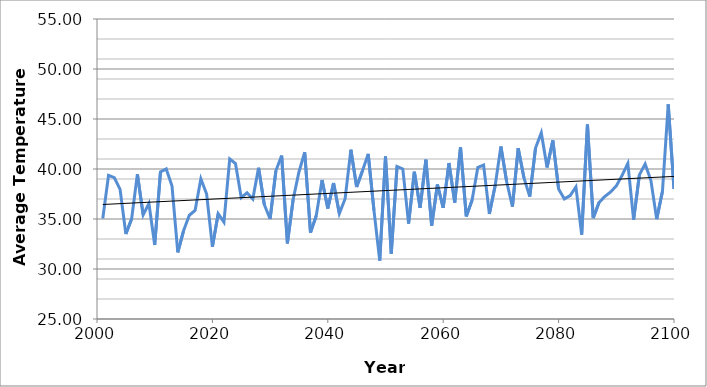
| Category | B1 |
|---|---|
| 2001.0 | 35.049 |
| 2002.0 | 39.366 |
| 2003.0 | 39.132 |
| 2004.0 | 37.967 |
| 2005.0 | 33.507 |
| 2006.0 | 35.006 |
| 2007.0 | 39.49 |
| 2008.0 | 35.413 |
| 2009.0 | 36.547 |
| 2010.0 | 32.401 |
| 2011.0 | 39.699 |
| 2012.0 | 40.008 |
| 2013.0 | 38.286 |
| 2014.0 | 31.662 |
| 2015.0 | 33.818 |
| 2016.0 | 35.375 |
| 2017.0 | 35.857 |
| 2018.0 | 39.024 |
| 2019.0 | 37.492 |
| 2020.0 | 32.218 |
| 2021.0 | 35.53 |
| 2022.0 | 34.678 |
| 2023.0 | 41.005 |
| 2024.0 | 40.539 |
| 2025.0 | 37.125 |
| 2026.0 | 37.616 |
| 2027.0 | 36.991 |
| 2028.0 | 40.134 |
| 2029.0 | 36.43 |
| 2030.0 | 34.995 |
| 2031.0 | 39.816 |
| 2032.0 | 41.34 |
| 2033.0 | 32.563 |
| 2034.0 | 36.97 |
| 2035.0 | 39.702 |
| 2036.0 | 41.675 |
| 2037.0 | 33.638 |
| 2038.0 | 35.334 |
| 2039.0 | 38.899 |
| 2040.0 | 36.052 |
| 2041.0 | 38.592 |
| 2042.0 | 35.535 |
| 2043.0 | 37.026 |
| 2044.0 | 41.931 |
| 2045.0 | 38.206 |
| 2046.0 | 39.81 |
| 2047.0 | 41.513 |
| 2048.0 | 35.872 |
| 2049.0 | 30.835 |
| 2050.0 | 41.252 |
| 2051.0 | 31.536 |
| 2052.0 | 40.253 |
| 2053.0 | 40.005 |
| 2054.0 | 34.545 |
| 2055.0 | 39.727 |
| 2056.0 | 36.115 |
| 2057.0 | 40.926 |
| 2058.0 | 34.333 |
| 2059.0 | 38.448 |
| 2060.0 | 36.124 |
| 2061.0 | 40.593 |
| 2062.0 | 36.64 |
| 2063.0 | 42.181 |
| 2064.0 | 35.263 |
| 2065.0 | 36.871 |
| 2066.0 | 40.156 |
| 2067.0 | 40.395 |
| 2068.0 | 35.501 |
| 2069.0 | 38.318 |
| 2070.0 | 42.242 |
| 2071.0 | 38.728 |
| 2072.0 | 36.239 |
| 2073.0 | 42.084 |
| 2074.0 | 39.106 |
| 2075.0 | 37.242 |
| 2076.0 | 42.093 |
| 2077.0 | 43.615 |
| 2078.0 | 40.158 |
| 2079.0 | 42.856 |
| 2080.0 | 38.01 |
| 2081.0 | 37.009 |
| 2082.0 | 37.339 |
| 2083.0 | 38.208 |
| 2084.0 | 33.436 |
| 2085.0 | 44.449 |
| 2086.0 | 35.091 |
| 2087.0 | 36.642 |
| 2088.0 | 37.249 |
| 2089.0 | 37.697 |
| 2090.0 | 38.309 |
| 2091.0 | 39.357 |
| 2092.0 | 40.555 |
| 2093.0 | 34.93 |
| 2094.0 | 39.412 |
| 2095.0 | 40.51 |
| 2096.0 | 38.849 |
| 2097.0 | 34.99 |
| 2098.0 | 37.767 |
| 2099.0 | 46.47 |
| 2100.0 | 38.001 |